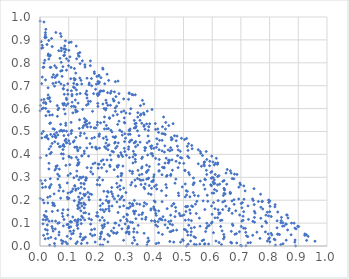
| Category | Series 0 |
|---|---|
| 0.22983809154558177 | 0.45 |
| 0.19908134419561374 | 0.146 |
| 0.5997152492428129 | 0.138 |
| 0.007164142219287739 | 0.599 |
| 0.0896939707701141 | 0.536 |
| 0.6073219868968796 | 0.289 |
| 0.7247909522949211 | 0.175 |
| 0.785337218605948 | 0.062 |
| 0.29158274670867035 | 0.253 |
| 0.219119030528239 | 0.62 |
| 0.079895417914022 | 0.783 |
| 0.443010123358736 | 0.163 |
| 0.23539410950892115 | 0.67 |
| 0.645104258136213 | 0.227 |
| 0.035342745410344545 | 0.217 |
| 0.2579486268440402 | 0.635 |
| 0.455182996522688 | 0.135 |
| 0.22076034341037032 | 0.47 |
| 0.8390355387167334 | 0.006 |
| 0.32476230325268296 | 0.66 |
| 0.5156626599115601 | 0.418 |
| 0.4787509487049356 | 0.436 |
| 0.0877488907301438 | 0.577 |
| 0.595202582789979 | 0.321 |
| 0.6071347860901503 | 0.354 |
| 0.4775670412982136 | 0.48 |
| 0.3501365986118308 | 0.571 |
| 0.3991076413278829 | 0.11 |
| 0.8345178748961445 | 0.05 |
| 0.4131506133833801 | 0.058 |
| 0.6323493692801058 | 0.006 |
| 0.413924206753268 | 0.357 |
| 0.10716386330045502 | 0.731 |
| 0.20674361933425922 | 0.67 |
| 0.13737334830626802 | 0.166 |
| 0.03599392520353095 | 0.833 |
| 0.6105676300017907 | 0.312 |
| 0.6659491913276745 | 0.318 |
| 0.1944987126120863 | 0.432 |
| 0.3768543084163112 | 0.294 |
| 0.32606241878501774 | 0.152 |
| 0.38856958640230965 | 0.252 |
| 0.6231583697942464 | 0.145 |
| 0.4479428745143794 | 0.375 |
| 0.41321850433086904 | 0.013 |
| 0.13390328740313096 | 0.356 |
| 0.5060785191635422 | 0.113 |
| 0.199606144191254 | 0.529 |
| 0.1354090898197403 | 0.29 |
| 0.028877624520622813 | 0.838 |
| 0.28159544959392213 | 0.408 |
| 0.3421246557540789 | 0.09 |
| 0.5133927415989192 | 0.062 |
| 0.05088615665107199 | 0.176 |
| 0.19420080566828313 | 0.516 |
| 0.7032864062047856 | 0.109 |
| 0.8887547121127627 | 0.026 |
| 0.34866646372176424 | 0.453 |
| 0.03736758330463574 | 0.435 |
| 0.4104263386234581 | 0.511 |
| 0.43568910513222026 | 0.092 |
| 0.02880936269122425 | 0.033 |
| 0.7012777690200064 | 0.085 |
| 0.10220997588266534 | 0.083 |
| 0.27101619630426665 | 0.303 |
| 0.04540022441170455 | 0.178 |
| 0.12280621910876055 | 0.728 |
| 0.1643618203284496 | 0.013 |
| 0.5247848008572266 | 0.022 |
| 0.12408645955396047 | 0.594 |
| 0.46171155610594206 | 0.092 |
| 0.007617393135581629 | 0.272 |
| 0.45898449277911313 | 0.175 |
| 0.3781097017972552 | 0.229 |
| 0.20286624528919395 | 0.357 |
| 0.6144595964485684 | 0.383 |
| 0.15229889223409165 | 0.03 |
| 0.1117856311010701 | 0.628 |
| 0.24804315806640787 | 0.237 |
| 0.33272913747503896 | 0.367 |
| 0.3035531496797539 | 0.062 |
| 0.7962292203806334 | 0.132 |
| 0.4853390283668756 | 0.142 |
| 0.31640210495510757 | 0.267 |
| 0.6231140348466867 | 0.139 |
| 0.09086266219053751 | 0.467 |
| 0.43968877468958567 | 0.383 |
| 0.268717188682862 | 0.435 |
| 0.022285916052544708 | 0.395 |
| 0.10389294350010947 | 0.447 |
| 0.35525159273680784 | 0.313 |
| 0.06670246190643081 | 0.06 |
| 0.033506185843492076 | 0.648 |
| 0.23325937065642555 | 0.512 |
| 0.11452356110021011 | 0.249 |
| 0.011025209764628285 | 0.78 |
| 0.045823529845827715 | 0.065 |
| 0.20989672082118782 | 0.176 |
| 0.570576026044303 | 0.027 |
| 0.3649117956664385 | 0.43 |
| 0.20868737621393352 | 0.112 |
| 0.1403265596849641 | 0.041 |
| 0.02700071082554878 | 0.212 |
| 0.38718158488236554 | 0.404 |
| 0.7075553747272044 | 0.13 |
| 0.3720529570165254 | 0.326 |
| 0.15567668014802405 | 0.114 |
| 0.28672232660946606 | 0.484 |
| 0.05554128268936154 | 0.475 |
| 0.09940471700641818 | 0.787 |
| 0.2719187144018069 | 0.146 |
| 0.014164852589793386 | 0.188 |
| 0.18311111495142085 | 0.588 |
| 0.6276213720788766 | 0.144 |
| 0.10872468609692443 | 0.491 |
| 0.31307419825304716 | 0.578 |
| 0.030990323315914226 | 0.586 |
| 0.03175941649704195 | 0.108 |
| 0.16819915318497713 | 0.62 |
| 0.4254553147707639 | 0.193 |
| 0.3239704404850302 | 0.389 |
| 0.3027332633106037 | 0.139 |
| 0.24528816542921406 | 0.615 |
| 0.2744900246830806 | 0.626 |
| 0.0016132835974653759 | 0.613 |
| 0.5108319466928872 | 0.223 |
| 0.09678883453738518 | 0.708 |
| 0.6644558962595496 | 0.016 |
| 0.011944409224524999 | 0.602 |
| 0.22418093780381787 | 0.112 |
| 0.29575154876046983 | 0.49 |
| 0.6081089474664243 | 0.246 |
| 0.5743116641976139 | 0.159 |
| 0.20032399036211235 | 0.541 |
| 0.2518926324256404 | 0.228 |
| 0.23234154357522796 | 0.326 |
| 0.07933373705166058 | 0.621 |
| 0.057720172669965986 | 0.495 |
| 0.0969131433352669 | 0.663 |
| 0.21874196182944483 | 0.078 |
| 0.20704820482246056 | 0.716 |
| 0.6044765502008079 | 0.058 |
| 0.0767854849550389 | 0.766 |
| 0.5972340974798366 | 0.263 |
| 0.32795129650782073 | 0.45 |
| 0.3141104313805243 | 0.488 |
| 0.03724323385470163 | 0.487 |
| 0.6129981063594038 | 0.022 |
| 0.12658543550032653 | 0.387 |
| 0.15893479047508952 | 0.665 |
| 0.34762550791678803 | 0.182 |
| 0.48948382274912483 | 0.386 |
| 0.29390892636402466 | 0.54 |
| 0.308312179387804 | 0.488 |
| 0.3736149660130915 | 0.451 |
| 0.8003424592011547 | 0.15 |
| 0.2880554089311357 | 0.391 |
| 0.042440095355538054 | 0.448 |
| 0.1715144655749572 | 0.201 |
| 0.4530515206350513 | 0.062 |
| 0.43226397837806274 | 0.344 |
| 0.10823628351324421 | 0.78 |
| 0.3550344364510811 | 0.138 |
| 0.40965054416847324 | 0.085 |
| 0.09500624970112082 | 0.275 |
| 0.24993690789494627 | 0.255 |
| 0.1694066818932014 | 0.213 |
| 0.01691803221158772 | 0.811 |
| 0.2783758258632181 | 0.203 |
| 0.06255187865633749 | 0.485 |
| 0.1635770097083742 | 0.66 |
| 0.06669669389092658 | 0.102 |
| 0.1308371426013395 | 0.094 |
| 0.23563879771404894 | 0.437 |
| 0.018748032503698386 | 0.627 |
| 0.22940146049316168 | 0.16 |
| 0.7737500048406573 | 0.194 |
| 0.14602327310163798 | 0.174 |
| 0.017952345185939356 | 0.128 |
| 0.44864140003763264 | 0.526 |
| 0.27058253909306973 | 0.531 |
| 0.21506976572818637 | 0.061 |
| 0.4861445456414326 | 0.362 |
| 0.20580685581144864 | 0.745 |
| 0.08452357790766629 | 0.662 |
| 0.3462890375992945 | 0.31 |
| 0.4254284424426502 | 0.461 |
| 0.15848723044341384 | 0.145 |
| 0.20607682915421321 | 0.485 |
| 0.09602733823993781 | 0.68 |
| 0.07718084197310515 | 0.011 |
| 0.37144409473967255 | 0.353 |
| 0.09851047647850619 | 0.485 |
| 0.6411399651229285 | 0.23 |
| 0.5443122631118559 | 0.006 |
| 0.4761707603546661 | 0.069 |
| 0.09227072142790615 | 0.768 |
| 0.025740941462616296 | 0.053 |
| 0.09675312777924316 | 0.135 |
| 0.028545784552477693 | 0.832 |
| 0.3622522345572261 | 0.522 |
| 0.1753061794836165 | 0.788 |
| 0.310397906227159 | 0.506 |
| 0.7759898915266076 | 0.162 |
| 0.2248600024443631 | 0.095 |
| 0.42533160733147846 | 0.415 |
| 0.0744034372403356 | 0.025 |
| 0.12055550747132071 | 0.724 |
| 0.2547603186861138 | 0.642 |
| 0.2057409850787344 | 0.662 |
| 0.04905516021205014 | 0.227 |
| 0.34498503380746937 | 0.481 |
| 0.380623455098299 | 0.458 |
| 0.48326859362825947 | 0.22 |
| 0.15271770023522313 | 0.145 |
| 0.04413134343838154 | 0.188 |
| 0.45131135457855 | 0.374 |
| 0.3869929599295576 | 0.162 |
| 0.1640231174960599 | 0.646 |
| 0.304521435448285 | 0.109 |
| 0.23669357025463855 | 0.42 |
| 0.356895663625873 | 0.388 |
| 0.1159264949751404 | 0.454 |
| 0.059843895824129856 | 0.351 |
| 0.08387463128303485 | 0.701 |
| 0.16263499036834217 | 0.676 |
| 0.05523552133052967 | 0.932 |
| 0.22450591101016404 | 0.511 |
| 0.10877854047117186 | 0.89 |
| 0.3772847795016342 | 0.332 |
| 0.1543583846650134 | 0.404 |
| 0.5812953764688514 | 0.099 |
| 0.14619732621630221 | 0.394 |
| 0.4250839352089274 | 0.311 |
| 0.020333274851094152 | 0.946 |
| 0.6056954125628229 | 0.231 |
| 0.2355532261898352 | 0.239 |
| 0.6437041074074213 | 0.197 |
| 0.14000684765860272 | 0.481 |
| 0.22314401159106578 | 0.6 |
| 0.3376150945769444 | 0.184 |
| 0.1317986939736795 | 0.421 |
| 0.47925066438179953 | 0.395 |
| 0.5208977670027006 | 0.312 |
| 0.17214400712558453 | 0.537 |
| 0.3861492801350066 | 0.157 |
| 0.09290882718524807 | 0.639 |
| 0.599848263608036 | 0.105 |
| 0.1395450828479352 | 0.429 |
| 0.32187929252849545 | 0.012 |
| 0.6697621595087512 | 0.294 |
| 0.14560242676707014 | 0.393 |
| 0.21006782144416358 | 0.202 |
| 0.21015814796999333 | 0.005 |
| 0.10611572812626646 | 0.316 |
| 0.05054435200333651 | 0.698 |
| 0.31071254869767173 | 0.666 |
| 0.29792255460001793 | 0.471 |
| 0.7923790093324606 | 0.022 |
| 0.010213812408769618 | 0.201 |
| 0.7950711700985938 | 0.052 |
| 0.5969032744555915 | 0.099 |
| 0.0977804209362122 | 0.308 |
| 0.2915377786584893 | 0.127 |
| 0.2252557374518328 | 0.433 |
| 0.1637505645012356 | 0.733 |
| 0.3989233672886223 | 0.26 |
| 0.23000925067452194 | 0.427 |
| 0.7096887750839194 | 0.15 |
| 0.30828797830343513 | 0.086 |
| 0.10649183513537908 | 0.105 |
| 0.6096933257276025 | 0.123 |
| 0.8285788000990977 | 0.052 |
| 0.508426140526527 | 0.151 |
| 0.11798784120122419 | 0.298 |
| 0.1289301922075382 | 0.706 |
| 0.24772258445125672 | 0.376 |
| 0.1013909108808072 | 0.888 |
| 0.18684375712900825 | 0.665 |
| 0.14876023751280865 | 0.597 |
| 0.3950245466585307 | 0.288 |
| 0.7456210005944095 | 0.25 |
| 0.25472191362465946 | 0.477 |
| 0.5683867178307993 | 0.197 |
| 0.5238003077790268 | 0.143 |
| 0.31153030664515224 | 0.386 |
| 0.5515167687683253 | 0.219 |
| 0.35569195992829883 | 0.346 |
| 0.1247621332642429 | 0.585 |
| 0.5027710454159313 | 0.073 |
| 0.1902489095130374 | 0.074 |
| 0.09741498669134696 | 0.231 |
| 0.5723888892260892 | 0.364 |
| 0.5222608605613729 | 0.215 |
| 0.32631447980996575 | 0.062 |
| 0.14303014366388211 | 0.187 |
| 0.16832980466647773 | 0.632 |
| 0.7471970705102083 | 0.125 |
| 0.013825763591752027 | 0.978 |
| 0.23756245329570702 | 0.234 |
| 0.6790439514985744 | 0.051 |
| 0.12694784922845181 | 0.682 |
| 0.31632442935935057 | 0.599 |
| 0.5746501478011992 | 0.249 |
| 0.2672810010500014 | 0.273 |
| 0.10943289210255869 | 0.678 |
| 0.23632079960687413 | 0.101 |
| 0.3346532825761013 | 0.522 |
| 0.07447348686510236 | 0.403 |
| 0.1984551489870775 | 0.741 |
| 0.2725122334901875 | 0.45 |
| 0.3638426316533929 | 0.189 |
| 0.8763490545420551 | 0.1 |
| 0.018412435191031085 | 0.287 |
| 0.39350846236505743 | 0.282 |
| 0.142209735021382 | 0.154 |
| 0.5269304442516334 | 0.078 |
| 0.5949460810735385 | 0.267 |
| 0.8748520122112083 | 0.049 |
| 0.4552375410246655 | 0.308 |
| 0.11438088942698654 | 0.581 |
| 0.0003297571966303092 | 0.591 |
| 0.36171467460315165 | 0.174 |
| 0.1194945845688754 | 0.198 |
| 0.8581957649946669 | 0.096 |
| 0.27530601115749875 | 0.545 |
| 0.06736494009097382 | 0.336 |
| 0.2133387354526326 | 0.371 |
| 0.018967761436113673 | 0.922 |
| 0.7416334876939826 | 0.108 |
| 0.2691589806486965 | 0.059 |
| 0.05006375170137756 | 0.488 |
| 0.710655721675009 | 0.204 |
| 0.028331206632878914 | 0.659 |
| 0.2778698911681382 | 0.506 |
| 0.04537954547279377 | 0.512 |
| 0.00955417004823178 | 0.866 |
| 0.21892440444494843 | 0.158 |
| 0.5764943431774067 | 0.29 |
| 0.641332280617996 | 0.286 |
| 0.2019568935867051 | 0.718 |
| 0.1117294224556179 | 0.662 |
| 0.5568156726696044 | 0.009 |
| 0.5383375147326835 | 0.221 |
| 0.21731861665811392 | 0.124 |
| 0.043562008498204574 | 0.478 |
| 0.02265771651631643 | 0.127 |
| 0.30547117231487464 | 0.077 |
| 0.33960100745389643 | 0.503 |
| 0.3516630818490215 | 0.576 |
| 0.26699960847603 | 0.611 |
| 0.5161626294733838 | 0.008 |
| 0.10017747117981057 | 0.459 |
| 0.5705428388853448 | 0.267 |
| 0.37092924018513684 | 0.321 |
| 0.4087282657996669 | 0.445 |
| 0.1602416541253373 | 0.548 |
| 0.10093749636690752 | 0.392 |
| 0.7052309493782187 | 0.189 |
| 0.7995620998779427 | 0.035 |
| 0.31232437842302874 | 0.187 |
| 0.2378890744374268 | 0.192 |
| 0.2419529428164513 | 0.56 |
| 0.30087493365146967 | 0.396 |
| 0.09126630392012702 | 0.452 |
| 0.6238388037731578 | 0.015 |
| 0.1800265131965687 | 0.7 |
| 0.16011692055473126 | 0.299 |
| 0.19934760770364868 | 0.268 |
| 0.08141855229150918 | 0.685 |
| 0.010505134488856704 | 0.097 |
| 0.4702246636931964 | 0.274 |
| 0.13874376551618417 | 0.733 |
| 0.39785569216833405 | 0.197 |
| 0.06576655381160812 | 0.241 |
| 0.08006007172794993 | 0.421 |
| 0.3305785871625866 | 0.288 |
| 0.35764090931583503 | 0.145 |
| 0.027456154410407385 | 0.188 |
| 0.02300416168342545 | 0.475 |
| 0.6634401541523656 | 0.328 |
| 0.27362859896790204 | 0.352 |
| 0.8204217902253882 | 0.004 |
| 0.3129999979437813 | 0.328 |
| 0.7101781689570346 | 0.262 |
| 0.17650424499623363 | 0.096 |
| 0.38676085012707917 | 0.225 |
| 0.44659965223322295 | 0.419 |
| 0.352164696705934 | 0.269 |
| 0.2409870589059776 | 0.174 |
| 0.1098488991480252 | 0.105 |
| 0.29143534054435394 | 0.176 |
| 0.4207448839102671 | 0.118 |
| 0.17693648418896113 | 0.324 |
| 0.15535783641686085 | 0.219 |
| 0.10129233951164118 | 0.08 |
| 0.04243257153212954 | 0.737 |
| 0.5994236150625256 | 0.231 |
| 0.2572833044005568 | 0.079 |
| 0.4429885186334278 | 0.308 |
| 0.19765338497646479 | 0.423 |
| 0.09236046137000375 | 0.501 |
| 0.09723235908333183 | 0.621 |
| 0.474569462545823 | 0.46 |
| 0.68196055332521 | 0.154 |
| 0.2718994629979634 | 0.72 |
| 0.15644529535655272 | 0.54 |
| 0.9010268931847217 | 0.085 |
| 0.3541933756344131 | 0.382 |
| 0.20413184042774646 | 0.709 |
| 0.3783777124661357 | 0.296 |
| 0.5187034249076631 | 0.385 |
| 0.2913446741966711 | 0.025 |
| 0.09193069627780082 | 0.645 |
| 0.0334301473233366 | 0.254 |
| 0.39023041079782794 | 0.596 |
| 0.5809762713906712 | 0.312 |
| 0.707669149434351 | 0.112 |
| 0.11740138840578718 | 0.067 |
| 0.44104082679229717 | 0.255 |
| 0.02130999405792322 | 0.912 |
| 0.5663367206638138 | 0.395 |
| 0.5417802505153535 | 0.036 |
| 0.6595785318298041 | 0.163 |
| 0.40115120482887967 | 0.107 |
| 0.5651013244718905 | 0.023 |
| 0.334058092570407 | 0.119 |
| 0.10841984759470413 | 0.54 |
| 0.5107782542650815 | 0 |
| 0.5578578778705109 | 0.087 |
| 0.5464963626441423 | 0.195 |
| 0.005850839511487793 | 0.472 |
| 0.18911030534135276 | 0.76 |
| 0.23922625455697422 | 0.723 |
| 0.6088531466980809 | 0.273 |
| 0.2296727964449563 | 0.637 |
| 0.41545643747672023 | 0.378 |
| 0.05548190406240727 | 0.713 |
| 0.13278089774897717 | 0.624 |
| 0.8157932399359287 | 0.03 |
| 0.642054844559553 | 0.039 |
| 0.10386264685265334 | 0.355 |
| 0.20716756054192453 | 0.427 |
| 0.1538333645575244 | 0.27 |
| 0.32249637908279594 | 0.325 |
| 0.5282785100222223 | 0.175 |
| 0.45980679452926554 | 0.42 |
| 0.6344815472970814 | 0.066 |
| 0.28412332196228374 | 0.398 |
| 0.620697888162278 | 0.158 |
| 0.5515811419882717 | 0.42 |
| 0.22252128986249142 | 0.239 |
| 0.6636699696298394 | 0.231 |
| 0.017861685351662215 | 0.031 |
| 0.09504429866189112 | 0.009 |
| 0.12756824862064253 | 0.431 |
| 0.32377675979506115 | 0.176 |
| 0.37647056173340476 | 0.48 |
| 0.8392144233645228 | 0.101 |
| 0.2157915670712931 | 0.677 |
| 0.11028088405101633 | 0.053 |
| 0.15874170975797564 | 0.225 |
| 0.2967987316556876 | 0.096 |
| 0.1322302348566199 | 0.363 |
| 0.6956945030735663 | 0.135 |
| 0.08678031790423835 | 0.861 |
| 0.2627896808499185 | 0.588 |
| 0.12324553906847735 | 0.607 |
| 0.2312485183635674 | 0.527 |
| 0.40711816386848454 | 0.469 |
| 0.6094105534883463 | 0.163 |
| 0.45586507209330585 | 0.313 |
| 0.03804109599436645 | 0.78 |
| 0.43233375955910747 | 0.34 |
| 0.18479088550696332 | 0.359 |
| 0.320158508591197 | 0.662 |
| 0.7146847294360805 | 0.241 |
| 0.03382524597566561 | 0.259 |
| 0.06149360068070575 | 0.313 |
| 0.01973373441708204 | 0.114 |
| 0.23343858759627256 | 0.376 |
| 0.48849306399911807 | 0.132 |
| 0.5376040100924259 | 0.007 |
| 0.6393994848961945 | 0.031 |
| 0.818455024495479 | 0.171 |
| 0.3350896674969941 | 0.536 |
| 0.110480483096283 | 0.505 |
| 0.7240341633190557 | 0.041 |
| 0.5585015953794689 | 0.283 |
| 0.4659810963915374 | 0.017 |
| 0.42676031834220407 | 0.521 |
| 0.07219634070440062 | 0.764 |
| 0.2363665977274919 | 0.614 |
| 0.1826859060298326 | 0.045 |
| 0.7475893114301234 | 0.104 |
| 0.24200520785465096 | 0.044 |
| 0.5144376724834677 | 0.392 |
| 0.21847773720311148 | 0.777 |
| 0.5374254720393294 | 0.276 |
| 0.24225625867225964 | 0.557 |
| 0.012442873871048588 | 0.047 |
| 0.3084789643060576 | 0.423 |
| 0.4939027642042332 | 0.384 |
| 0.40180091608897683 | 0.535 |
| 0.16922006300866543 | 0.393 |
| 0.13210858135200232 | 0.179 |
| 0.4471251678507119 | 0.363 |
| 0.24060563641621613 | 0.196 |
| 0.034049979472449254 | 0.571 |
| 0.011065617490073731 | 0.115 |
| 0.105342481572271 | 0.065 |
| 0.3329270395966244 | 0.261 |
| 0.14405989904489302 | 0.297 |
| 0.17417847088035787 | 0.228 |
| 0.10538952561056691 | 0.106 |
| 0.9581421966861708 | 0.021 |
| 0.18973010301645232 | 0.474 |
| 0.6759297967849605 | 0.202 |
| 0.5791391215487673 | 0.413 |
| 0.033750627283980816 | 0.535 |
| 0.5178101564285752 | 0.321 |
| 0.2923887168531286 | 0.59 |
| 0.375088854308389 | 0.398 |
| 0.2611203915764875 | 0.1 |
| 0.5094575321897499 | 0.242 |
| 0.42528783269703996 | 0.491 |
| 0.4267778034146782 | 0.344 |
| 0.03778625696997384 | 0.038 |
| 0.48152222903780906 | 0.42 |
| 0.09737871355513472 | 0.158 |
| 0.1942244349229526 | 0.429 |
| 0.6389829288760931 | 0.221 |
| 0.41364354237235823 | 0.153 |
| 0.3853160545255848 | 0.435 |
| 0.08259335720314709 | 0.832 |
| 0.11579642854493988 | 0.055 |
| 0.0515692946916374 | 0.455 |
| 0.06735848690934276 | 0.305 |
| 0.2915028528496266 | 0.642 |
| 0.308460791666028 | 0.64 |
| 0.3286234246829691 | 0.548 |
| 0.5008563629636766 | 0.361 |
| 0.47226965303895596 | 0.169 |
| 0.054591986709697116 | 0.474 |
| 0.3386406784563618 | 0.06 |
| 0.5033334977521045 | 0.465 |
| 0.13438381104047392 | 0.83 |
| 0.15136107595194093 | 0.035 |
| 0.19954297960083212 | 0.664 |
| 0.31411875100803643 | 0.511 |
| 0.6988214468137611 | 0.267 |
| 0.43953830280979944 | 0.22 |
| 0.4255286360750511 | 0.114 |
| 0.8053340169615223 | 0.055 |
| 0.7495097289724649 | 0.144 |
| 0.007831793841000967 | 0.738 |
| 0.17090426612980925 | 0.704 |
| 0.27372720409583595 | 0.39 |
| 0.08209150655535602 | 0.615 |
| 0.5380603237017995 | 0.081 |
| 0.29931146623362437 | 0.233 |
| 0.32374976471833594 | 0.362 |
| 0.2635606872997509 | 0.478 |
| 0.38839543436019475 | 0.426 |
| 0.7176841306335754 | 0.001 |
| 0.013561376033001338 | 0.781 |
| 0.6183595441218668 | 0.357 |
| 0.2593649315224684 | 0.673 |
| 0.5136395957240167 | 0.239 |
| 0.001046849928671656 | 0.207 |
| 0.2850175077596826 | 0.499 |
| 0.12993587444031862 | 0.588 |
| 0.7009712456228683 | 0.186 |
| 0.043835905482007664 | 0.076 |
| 0.6369956819561499 | 0.282 |
| 0.09965065088244596 | 0.809 |
| 0.22368035815265852 | 0.15 |
| 0.25113869314758097 | 0.175 |
| 0.2623795001466853 | 0.718 |
| 0.21897610732814943 | 0.004 |
| 0.16219542556266342 | 0.471 |
| 0.3285681724133154 | 0.4 |
| 0.07113895367197687 | 0.434 |
| 0.4573369813568904 | 0.474 |
| 0.3388774088600235 | 0.007 |
| 0.6340281705844446 | 0.113 |
| 0.12937718688149968 | 0.103 |
| 0.6368320411075797 | 0.192 |
| 0.6478404972468087 | 0.174 |
| 0.6863580719871143 | 0.313 |
| 0.47402783756719014 | 0.37 |
| 0.13677537240101822 | 0.513 |
| 0.28256557163270346 | 0.287 |
| 0.2286907160184647 | 0.594 |
| 0.8258026152972829 | 0.079 |
| 0.06055140690201288 | 0.566 |
| 0.44919411851088276 | 0.367 |
| 0.79727810647802 | 0.19 |
| 0.9341220463402419 | 0.042 |
| 0.42025482078697673 | 0.118 |
| 0.30008330467448796 | 0.058 |
| 0.4361867620416521 | 0.113 |
| 0.37927559630223107 | 0.023 |
| 0.7198845275423773 | 0.044 |
| 0.6666566699621849 | 0.064 |
| 0.37196477854989374 | 0.292 |
| 0.052020839660744556 | 0.001 |
| 0.3623660785700197 | 0.256 |
| 0.6722112548785681 | 0.09 |
| 0.3331002809967669 | 0.152 |
| 0.10185156855351996 | 0.389 |
| 0.1387390096988952 | 0.202 |
| 0.019256369466926215 | 0.725 |
| 0.507449872713599 | 0.172 |
| 0.14766538337103519 | 0.809 |
| 0.31070930159871135 | 0.669 |
| 0.13246229822033573 | 0.377 |
| 0.3394845896473373 | 0.295 |
| 0.481168403840343 | 0.342 |
| 0.8462968658259709 | 0.102 |
| 0.012362392229383179 | 0.626 |
| 0.7695625642724592 | 0.169 |
| 0.6629801265883766 | 0.229 |
| 0.3654073557050346 | 0.417 |
| 0.005868267839504782 | 0.491 |
| 0.17678542131819852 | 0.52 |
| 0.07379858353850033 | 0.915 |
| 0.1710050632833463 | 0.12 |
| 0.21124512996820843 | 0.159 |
| 0.12531312977310238 | 0.011 |
| 0.2646648985111125 | 0.652 |
| 0.08982989586093582 | 0.017 |
| 0.09318836449005674 | 0.45 |
| 0.20199258728417635 | 0.61 |
| 0.19362659126665882 | 0.684 |
| 0.12802565685689138 | 0.306 |
| 0.372535028935728 | 0.004 |
| 0.3715675844283156 | 0.533 |
| 0.23173947018421504 | 0.625 |
| 0.5624040505836487 | 0.348 |
| 0.3330224804653644 | 0.398 |
| 0.3678532503866636 | 0.116 |
| 0.06642084102288281 | 0.716 |
| 0.4335663286456667 | 0.41 |
| 0.3151432347697991 | 0.461 |
| 0.7168333042819408 | 0.06 |
| 0.07761017417603266 | 0.143 |
| 0.49563347319558526 | 0.258 |
| 0.13985334968528795 | 0.666 |
| 0.030639733991403184 | 0.897 |
| 0.46141182268049485 | 0.331 |
| 0.05567169788946702 | 0.348 |
| 0.46373036584263916 | 0.534 |
| 0.27530070676149754 | 0.665 |
| 0.08100139349741242 | 0.687 |
| 0.7429205488561517 | 0.199 |
| 0.7331927890842173 | 0.015 |
| 0.8403759133265896 | 0.111 |
| 0.2395051948374758 | 0.163 |
| 0.2992415033909227 | 0.581 |
| 0.24463293957364374 | 0.397 |
| 0.0024579405141654798 | 0.286 |
| 0.23350019952718892 | 0.464 |
| 0.45785286358022415 | 0.463 |
| 0.41620517333085627 | 0.118 |
| 0.14173965098500818 | 0.053 |
| 0.15774537383486764 | 0.181 |
| 0.3788644881143316 | 0.521 |
| 0.7464729388665174 | 0.181 |
| 0.223426901780593 | 0.541 |
| 0.5341638437402618 | 0.234 |
| 0.19223355283064003 | 0.017 |
| 0.19180242507096823 | 0.363 |
| 0.2840761505455389 | 0.212 |
| 0.20577034109383951 | 0.479 |
| 0.6035981990897986 | 0.298 |
| 0.44065295817963845 | 0.304 |
| 0.34140090518414357 | 0.33 |
| 0.92256275840886 | 0.047 |
| 0.03873761867775549 | 0.268 |
| 0.06592071565910063 | 0.048 |
| 0.6403940539323004 | 0.05 |
| 0.46870246043408836 | 0.481 |
| 0.09419554742098502 | 0.093 |
| 0.0815330941499256 | 0.443 |
| 0.32720479762737986 | 0.149 |
| 0.3974778901189997 | 0.311 |
| 0.013861882727537522 | 0.799 |
| 0.413019744968843 | 0.496 |
| 0.5828406101579902 | 0.222 |
| 0.34055521024812907 | 0.441 |
| 0.030752958518464935 | 0.816 |
| 0.01886577960816238 | 0.073 |
| 0.8193559323367025 | 0.18 |
| 0.3627551873778835 | 0.527 |
| 0.7412730431847301 | 0.047 |
| 0.07208363649609317 | 0.209 |
| 0.04306260757984903 | 0.572 |
| 0.7966981950533119 | 0.031 |
| 0.17545489509218182 | 0.808 |
| 0.29364955193188247 | 0.559 |
| 0.0900612143977777 | 0.858 |
| 0.8561365447801629 | 0.096 |
| 0.5846427798265887 | 0.195 |
| 0.46523735635299246 | 0.184 |
| 0.4550906977072152 | 0.429 |
| 0.7920720708278822 | 0.147 |
| 0.2755860490711729 | 0.09 |
| 0.21825258806847692 | 0.185 |
| 0.2830898850140222 | 0.317 |
| 0.2726974499205229 | 0.395 |
| 0.6853904688942519 | 0.013 |
| 0.26031179541584193 | 0.449 |
| 0.45632003804728827 | 0.11 |
| 0.5727151309345602 | 0.35 |
| 0.1333471234252861 | 0.116 |
| 0.13974918552758175 | 0.796 |
| 0.09245338171168549 | 0.818 |
| 0.28902593287807365 | 0.349 |
| 0.5839465911075478 | 0.086 |
| 0.27805346436920664 | 0.171 |
| 0.09470996719132341 | 0.042 |
| 0.16322533621074808 | 0.532 |
| 0.07992239760024922 | 0.438 |
| 0.3106080896860678 | 0.061 |
| 0.92819875831006 | 0.049 |
| 0.47329735223945746 | 0.152 |
| 0.8008333004211189 | 0.197 |
| 0.09776587787279167 | 0.095 |
| 0.7694863777700617 | 0.121 |
| 0.02425668994270369 | 0.88 |
| 0.2569248054742196 | 0.058 |
| 0.801038873264505 | 0.018 |
| 0.4601607399499196 | 0.376 |
| 0.13873477118272648 | 0.845 |
| 0.3313384857595939 | 0.453 |
| 0.2569346102793135 | 0.057 |
| 0.08854976797747349 | 0.896 |
| 0.03133946428389267 | 0.361 |
| 0.08628631053819502 | 0.846 |
| 0.2937947564890887 | 0.427 |
| 0.3748799552968888 | 0.016 |
| 0.5217597325544605 | 0.157 |
| 0.3893521680757138 | 0.438 |
| 0.41504525201039066 | 0.42 |
| 0.3048149835074516 | 0.136 |
| 0.6190874228933945 | 0.303 |
| 0.14641699422671195 | 0.209 |
| 0.08385439253994342 | 0.597 |
| 0.23661610090439 | 0.018 |
| 0.2694758795108846 | 0.574 |
| 0.598537671431703 | 0.325 |
| 0.03570251241374234 | 0.294 |
| 0.09028489151009222 | 0.352 |
| 0.0687203914627239 | 0.502 |
| 0.26202183723249295 | 0.453 |
| 0.2309880751501142 | 0.199 |
| 0.7892549185249484 | 0.101 |
| 0.44479778823086347 | 0.079 |
| 0.38836024665424107 | 0.11 |
| 0.1282548630273821 | 0.663 |
| 0.43851020717108147 | 0.268 |
| 0.515219130196475 | 0.048 |
| 0.13201916569621697 | 0.109 |
| 0.1523223751810101 | 0.226 |
| 0.05013649013924093 | 0.509 |
| 0.4482263325249325 | 0.107 |
| 0.36588029521610776 | 0.51 |
| 0.35518715709661397 | 0.118 |
| 0.4820396276881629 | 0.231 |
| 0.6923366959066815 | 0.205 |
| 0.15504260508921575 | 0.25 |
| 0.2702288829531846 | 0.344 |
| 0.15274896461468934 | 0.188 |
| 0.2469440793030666 | 0.505 |
| 0.29268810367570486 | 0.2 |
| 0.17989862146113145 | 0.225 |
| 0.154255392026458 | 0.166 |
| 0.20609612072643024 | 0.357 |
| 0.5734217953538464 | 0.008 |
| 0.16213869272391412 | 0.615 |
| 0.669434342520663 | 0.143 |
| 0.08467583077984198 | 0.622 |
| 0.7859146090848776 | 0.108 |
| 0.4964271602490411 | 0.028 |
| 0.054311993528397995 | 0.109 |
| 0.0010043934658043874 | 0.385 |
| 0.025887375230840504 | 0.117 |
| 0.16319564186178714 | 0.428 |
| 0.6983998730837557 | 0.002 |
| 0.4305457838342597 | 0.563 |
| 0.850296389233931 | 0.088 |
| 0.1236794188804008 | 0.112 |
| 0.5710528791730959 | 0.355 |
| 0.5996737226927208 | 0.299 |
| 0.5275749386702289 | 0.111 |
| 0.36079082177513055 | 0.581 |
| 0.03157625841509715 | 0.424 |
| 0.11148122491659729 | 0.239 |
| 0.15683088810770285 | 0.781 |
| 0.6964818441646387 | 0.275 |
| 0.43514477470513013 | 0.437 |
| 0.046742627700070316 | 0.748 |
| 0.5968625439782828 | 0.296 |
| 0.6482210143608772 | 0.318 |
| 0.6365496655152194 | 0.159 |
| 0.15825296385607146 | 0.039 |
| 0.10667471488494473 | 0.032 |
| 0.5346792323479308 | 0.297 |
| 0.1489975697415541 | 0.517 |
| 0.19699309918372854 | 0.131 |
| 0.18891509185438637 | 0.516 |
| 0.15642575667131786 | 0.791 |
| 0.04222730407047848 | 0.109 |
| 0.014862018574055114 | 0.134 |
| 0.31973590191573975 | 0.463 |
| 0.527184798185021 | 0.062 |
| 0.6026502145411222 | 0.367 |
| 0.19674845272171548 | 0.707 |
| 0.020605325029193988 | 0.621 |
| 0.7263989900923171 | 0.116 |
| 0.5446079226977579 | 0.142 |
| 0.40676897144285407 | 0.249 |
| 0.05023395329174929 | 0.011 |
| 0.13797143958392455 | 0.186 |
| 0.3018370973388438 | 0.116 |
| 0.005338423755096522 | 0.863 |
| 0.6776795763177432 | 0.314 |
| 0.14688705288352277 | 0.026 |
| 0.7734955005111254 | 0.086 |
| 0.23374865259232613 | 0.75 |
| 0.48993908840981537 | 0.017 |
| 0.3569155014036659 | 0.636 |
| 0.4607883866906549 | 0.467 |
| 0.23650975808030117 | 0.051 |
| 0.2865703081561587 | 0.217 |
| 0.15012838716194477 | 0.302 |
| 0.053262072357693424 | 0.074 |
| 0.3225091818809068 | 0.184 |
| 0.0808231428189049 | 0.382 |
| 0.4371407621705429 | 0.51 |
| 0.060086755846843976 | 0.613 |
| 0.17936663757435867 | 0.115 |
| 0.3646959365357074 | 0.25 |
| 0.08376504737914481 | 0.504 |
| 0.04006582925424629 | 0.906 |
| 0.1533537460398866 | 0.183 |
| 0.07386854299457568 | 0.506 |
| 0.5256365118735866 | 0.047 |
| 0.1317585090204172 | 0.416 |
| 0.02820122844541806 | 0.588 |
| 0.06537962001497699 | 0.853 |
| 0.5417171833420189 | 0.183 |
| 0.270129554699157 | 0.257 |
| 0.574529577746519 | 0.01 |
| 0.5769208421475767 | 0.063 |
| 0.6186744212054441 | 0.123 |
| 0.12126080849665932 | 0.112 |
| 0.07699680673514409 | 0.741 |
| 0.33187361440319685 | 0.379 |
| 0.0512981326955243 | 0.787 |
| 0.04812675604911454 | 0.185 |
| 0.5054812246521942 | 0.33 |
| 0.1744282103829926 | 0.447 |
| 0.340892226844577 | 0.582 |
| 0.14922930747834906 | 0.124 |
| 0.5319179017072497 | 0.172 |
| 0.21100191069455276 | 0.055 |
| 0.33300664458037954 | 0.434 |
| 0.22200137084122284 | 0.677 |
| 0.020521606972144668 | 0.569 |
| 0.035452218563024385 | 0.78 |
| 0.310340904750228 | 0.053 |
| 0.27953078122047925 | 0.246 |
| 0.7870763182876382 | 0.135 |
| 0.05762589611119029 | 0.743 |
| 0.45328753719928205 | 0.096 |
| 0.3334689972915357 | 0.456 |
| 0.9227971435524341 | 0.053 |
| 0.2854305450952753 | 0.316 |
| 0.2184681471602663 | 0.288 |
| 0.25737279528254464 | 0.633 |
| 0.04291592624914353 | 0.151 |
| 0.33212308721618167 | 0.66 |
| 0.053193774273414984 | 0.481 |
| 0.09106246006187324 | 0.614 |
| 0.21078948757857718 | 0.538 |
| 0.0628540400960016 | 0.446 |
| 0.40280751193577446 | 0.383 |
| 0.12465018564383756 | 0.755 |
| 0.12851059012824728 | 0.432 |
| 0.36183687722435387 | 0.62 |
| 0.13447022103292028 | 0.214 |
| 0.062407153723514464 | 0.099 |
| 0.11874264208067031 | 0.732 |
| 0.3693310937175184 | 0.125 |
| 0.49288641892566176 | 0.47 |
| 0.019566342504220846 | 0.258 |
| 0.3327373983022659 | 0.516 |
| 0.003862295681528627 | 0.637 |
| 0.12508246198234207 | 0.249 |
| 0.2043660393041944 | 0.743 |
| 0.8594760356624691 | 0.136 |
| 0.16184099197446944 | 0.295 |
| 0.12764785331046624 | 0.817 |
| 0.12922637924445868 | 0.705 |
| 0.0181536110840973 | 0.91 |
| 0.8981147789623779 | 0.086 |
| 0.20669325962063378 | 0.299 |
| 0.1807126537604251 | 0.47 |
| 0.07933414500913216 | 0.129 |
| 0.7664222149741636 | 0.033 |
| 0.3215935971954804 | 0.317 |
| 0.885407368198286 | 0.1 |
| 0.021222143251904302 | 0.152 |
| 0.15307536473935168 | 0.273 |
| 0.008881452741291151 | 0.255 |
| 0.3500463485713381 | 0.613 |
| 0.8879209724194703 | 0.017 |
| 0.13169804044931477 | 0.175 |
| 0.27251139741864727 | 0.219 |
| 0.5042444351177279 | 0.33 |
| 0.14161454249225125 | 0.493 |
| 0.0807128020463832 | 0.02 |
| 0.0782523852167184 | 0.501 |
| 0.25490362164515223 | 0.57 |
| 0.3806529719668643 | 0.264 |
| 0.07108889005848307 | 0.928 |
| 0.4286585530529896 | 0.128 |
| 0.8452476606608146 | 0.087 |
| 0.06256044492838464 | 0.595 |
| 0.14162851310402713 | 0.114 |
| 0.1797022239690531 | 0.071 |
| 0.04248296746631597 | 0.871 |
| 0.39624266650612183 | 0.301 |
| 0.24299702347329444 | 0.353 |
| 0.8281208577108036 | 0.052 |
| 0.6045435041118383 | 0.19 |
| 0.1906788371277507 | 0.048 |
| 0.8904536604941898 | 0.001 |
| 0.7246071866526301 | 0.014 |
| 0.5179494982440023 | 0.115 |
| 0.07196333967614832 | 0.531 |
| 0.5909023163439789 | 0.351 |
| 0.005757172007645028 | 0.709 |
| 0.051843214155464445 | 0.332 |
| 0.08109954445963319 | 0.24 |
| 0.070141222330938 | 0.256 |
| 0.6522464096509558 | 0.334 |
| 0.3711787825421309 | 0.183 |
| 0.5077058084510918 | 0.07 |
| 0.06774229462114134 | 0.266 |
| 0.8261672602963906 | 0.11 |
| 0.6187445563702902 | 0.267 |
| 0.033475779375095716 | 0.003 |
| 0.1666361534360844 | 0.234 |
| 0.5300206834544631 | 0.425 |
| 0.18382451732888705 | 0.314 |
| 0.6625755330432792 | 0.235 |
| 0.8058161262741939 | 0.129 |
| 0.17163694524470385 | 0.712 |
| 0.013997008638993336 | 0.64 |
| 0.13606923178459462 | 0.364 |
| 0.6688670377121442 | 0.197 |
| 0.16201035291656196 | 0.546 |
| 0.1299692243652405 | 0.352 |
| 0.250886862267779 | 0.498 |
| 0.17571501571949744 | 0.631 |
| 0.1546906017949291 | 0.556 |
| 0.20801078410161267 | 0.266 |
| 0.23333433070412102 | 0.216 |
| 0.6285707696290735 | 0.111 |
| 0.07395690389638798 | 0.802 |
| 0.06772783984471964 | 0.433 |
| 0.21336430156981345 | 0.053 |
| 0.6704983321353004 | 0.095 |
| 0.06222425573413626 | 0.292 |
| 0.017776183170066573 | 0.476 |
| 0.38915957222819597 | 0.282 |
| 0.05421335553404871 | 0.032 |
| 0.5106580635930328 | 0.47 |
| 0.5177819365558681 | 0.447 |
| 0.9289679084877422 | 0.024 |
| 0.20911950830094395 | 0.031 |
| 0.2657772463391188 | 0.055 |
| 0.1284560060729707 | 0.327 |
| 0.40314352050879254 | 0.142 |
| 0.3407029342938357 | 0.563 |
| 0.2585640286258263 | 0.333 |
| 0.0824074720090977 | 0.861 |
| 0.031026874307077845 | 0.336 |
| 0.4888698999691843 | 0.413 |
| 0.16501895976268077 | 0.52 |
| 0.2405612683740933 | 0.442 |
| 0.43205211117770814 | 0.49 |
| 0.3959885175773401 | 0.171 |
| 0.4235729850962652 | 0.241 |
| 0.28310582801140416 | 0.307 |
| 0.5733352739343106 | 0.367 |
| 0.37646806472428607 | 0.034 |
| 0.513416732209599 | 0.436 |
| 0.6419184853632239 | 0.249 |
| 0.39287632862346233 | 0.393 |
| 0.01889731601263711 | 0.932 |
| 0.031328391624385055 | 0.643 |
| 0.10439150287377863 | 0.826 |
| 0.4735332524430039 | 0.292 |
| 0.13642942866362007 | 0.829 |
| 0.5103360678218057 | 0.172 |
| 0.32014352874416196 | 0.278 |
| 0.21947141872834564 | 0.772 |
| 0.24540809074283565 | 0.667 |
| 0.13194656651720826 | 0.163 |
| 0.0836247805642496 | 0.116 |
| 0.43576783634826377 | 0.362 |
| 0.4950317817993798 | 0.132 |
| 0.025593325391388144 | 0.069 |
| 0.6157586607854478 | 0.241 |
| 0.17916105854570508 | 0.731 |
| 0.20023694076751553 | 0.288 |
| 0.5975144966859639 | 0.175 |
| 0.08136495611419614 | 0.088 |
| 0.3474411432835982 | 0.29 |
| 0.5917285564326229 | 0.37 |
| 0.2301843068592001 | 0.6 |
| 0.5337519027351073 | 0.268 |
| 0.26796927360062417 | 0.193 |
| 0.004048907594474405 | 0.892 |
| 0.13288159301395042 | 0.84 |
| 0.3812418348621225 | 0.347 |
| 0.11655236810539593 | 0.694 |
| 0.07286579423145167 | 0.708 |
| 0.2805490073390461 | 0.111 |
| 0.1440904499573964 | 0.011 |
| 0.21240079542978219 | 0.735 |
| 0.1642003459515815 | 0.342 |
| 0.2507064708482428 | 0.414 |
| 0.5146184425438551 | 0.173 |
| 0.20708027361396064 | 0.489 |
| 0.5810354234701913 | 0.378 |
| 0.40551577762526914 | 0.267 |
| 0.3092804029918049 | 0.165 |
| 0.22400717847335094 | 0.029 |
| 0.466578251434141 | 0.184 |
| 0.02713113539438483 | 0.645 |
| 0.5514222530486187 | 0.359 |
| 0.31153347346141946 | 0.454 |
| 0.40545268178187466 | 0.431 |
| 0.5016860680664417 | 0.136 |
| 0.579682400698681 | 0.078 |
| 0.11911546859543909 | 0.46 |
| 0.08442678983143204 | 0.434 |
| 0.20267834861151834 | 0.34 |
| 0.6208415835534247 | 0.198 |
| 0.08053039599393286 | 0.158 |
| 0.5366120958139445 | 0.041 |
| 0.12514358609265708 | 0.474 |
| 0.8642095482883163 | 0.122 |
| 0.11992542324292976 | 0.775 |
| 0.7608313113821443 | 0.194 |
| 0.15175910275967164 | 0.525 |
| 0.32848627566334254 | 0.515 |
| 0.7556460963488547 | 0.06 |
| 0.8466720957804754 | 0.01 |
| 0.20120280253445455 | 0.623 |
| 0.3116432963312582 | 0.503 |
| 0.1262665787665227 | 0.873 |
| 0.6842548916297124 | 0.054 |
| 0.11442178236293954 | 0.127 |
| 0.6113222973492568 | 0.361 |
| 0.30899217891552755 | 0.08 |
| 0.03402995636660233 | 0.829 |
| 0.574084400186795 | 0.292 |
| 0.7468048774367704 | 0.151 |
| 0.26231667708826 | 0.603 |
| 0.08127403311636738 | 0.401 |
| 0.10947215973964741 | 0.385 |
| 0.05652928724359163 | 0.339 |
| 0.5287898388257046 | 0.439 |
| 0.21090798857241289 | 0.04 |
| 0.028800628995908295 | 0.467 |
| 0.22372495848373697 | 0.086 |
| 0.715367789573204 | 0.077 |
| 0.6765186258454208 | 0.182 |
| 0.03653217857736102 | 0.538 |
| 0.39762817209477497 | 0.163 |
| 0.41636987339926723 | 0.461 |
| 0.6258774517462591 | 0.27 |
| 0.8612874987431739 | 0.135 |
| 0.23876272279265542 | 0.189 |
| 0.694770146736273 | 0.062 |
| 0.26092999230235525 | 0.473 |
| 0.2489387496577784 | 0.066 |
| 0.08702193102316058 | 0.461 |
| 0.2384680555607278 | 0.513 |
| 0.4032292288734908 | 0.092 |
| 0.7749077661729771 | 0.195 |
| 0.2560022539247109 | 0.411 |
| 0.21046003215521047 | 0.677 |
| 0.2951568608216424 | 0.413 |
| 0.0616712751846884 | 0.155 |
| 0.10642724760046984 | 0.234 |
| 0.14383613825062458 | 0.098 |
| 0.11142481941805915 | 0.655 |
| 0.21488145299598316 | 0.342 |
| 0.019922204238890573 | 0.601 |
| 0.40223077911210314 | 0.155 |
| 0.10058008812360408 | 0.854 |
| 0.3546296463503653 | 0.536 |
| 0.05200338246985281 | 0.736 |
| 0.862695661398457 | 0.07 |
| 0.438147291046718 | 0.54 |
| 0.15866895261064373 | 0.529 |
| 0.41119390668320044 | 0.107 |
| 0.03531212022274621 | 0.403 |
| 0.14327167497706705 | 0.257 |
| 0.3680421892630569 | 0.429 |
| 0.45297444098832185 | 0.415 |
| 0.035705226656315925 | 0.632 |
| 0.2955630113446468 | 0.537 |
| 0.24844275521099402 | 0.676 |
| 0.5553354138857104 | 0.122 |
| 0.3540847262638692 | 0.34 |
| 0.13010433660009424 | 0.018 |
| 0.8284457340816793 | 0.148 |
| 0.3737838460257775 | 0.589 |
| 0.5875870531923134 | 0.008 |
| 0.14498478365456702 | 0.13 |
| 0.09680045207139598 | 0.205 |
| 0.6575887476871082 | 0.155 |
| 0.10080010391823646 | 0.209 |
| 0.8413797501862097 | 0.125 |
| 0.2018201364306954 | 0.13 |
| 0.5601450185711807 | 0.405 |
| 0.1334964862004686 | 0.251 |
| 0.3089086759244848 | 0.433 |
| 0.3276261508227134 | 0.075 |
| 0.8189805101767723 | 0.027 |
| 0.11757481672631276 | 0.71 |
| 0.42621074419268834 | 0.051 |
| 0.5059518239168281 | 0.214 |
| 0.31490120363091434 | 0.172 |
| 0.1319161587733959 | 0.077 |
| 0.6754013431206971 | 0.293 |
| 0.21614592394583987 | 0.089 |
| 0.20160125269572549 | 0.657 |
| 0.05709138798307811 | 0.778 |
| 0.23008600623432485 | 0.477 |
| 0.3777284144624956 | 0.504 |
| 0.32891722024577474 | 0.199 |
| 0.0698441728842576 | 0.819 |
| 0.402649297921298 | 0.509 |
| 0.02562597937303368 | 0.092 |
| 0.13994559152963448 | 0.23 |
| 0.041500945474750583 | 0.085 |
| 0.2836531644226009 | 0.585 |
| 0.3220738842619494 | 0.102 |
| 0.15458083448625382 | 0.491 |
| 0.060009895120425316 | 0.747 |
| 0.39692888890238487 | 0.427 |
| 0.3914259996393801 | 0.403 |
| 0.36272015013494896 | 0.056 |
| 0.1289618461430856 | 0.089 |
| 0.5184736657169147 | 0.091 |
| 0.17849971626488448 | 0.341 |
| 0.4992974131576662 | 0.024 |
| 0.06536473324255598 | 0.602 |
| 0.14286905188746346 | 0.723 |
| 0.11726702670551048 | 0.61 |
| 0.33077264913471327 | 0.534 |
| 0.6928048492032047 | 0.257 |
| 0.8079285232394919 | 0.048 |
| 0.18971261080130797 | 0.753 |
| 0.0741281650340857 | 0.853 |
| 0.888177601124745 | 0.078 |
| 0.6194642285614361 | 0.363 |
| 0.8017279592314801 | 0.173 |
| 0.32668829045917924 | 0.037 |
| 0.2247129997701689 | 0.564 |
| 0.1098416082688437 | 0.502 |
| 0.8921881153382618 | 0.075 |
| 0.04526147531624303 | 0.71 |
| 0.08536741690032201 | 0.833 |
| 0.023968105536091744 | 0.483 |
| 0.12106714803235219 | 0.264 |
| 0.5893461321865815 | 0.09 |
| 0.1355528936284689 | 0.192 |
| 0.01724755996760119 | 0.912 |
| 0.5986837523413827 | 0.392 |
| 0.2635065290419063 | 0.427 |
| 0.24412349082354057 | 0.347 |
| 0.29453121827909423 | 0.456 |
| 0.6232256200859771 | 0.307 |
| 0.34824163917361595 | 0.549 |
| 0.3252964249687186 | 0.414 |
| 0.641021627209757 | 0.252 |
| 0.12121620385344434 | 0.261 |
| 0.15872982953186043 | 0.288 |
| 0.12299997078671232 | 0.637 |
| 0.3299898946197132 | 0.025 |
| 0.011450846376400703 | 0.501 |
| 0.12068057236599139 | 0.691 |
| 0.8579445161099126 | 0.025 |
| 0.5586384206843505 | 0.413 |
| 0.6295458055612355 | 0.085 |
| 0.13777802348978418 | 0.551 |
| 0.08977414990428834 | 0.527 |
| 0.12115798371849773 | 0.431 |
| 0.41448195688347733 | 0.327 |
| 0.40507730823473065 | 0.134 |
| 0.6506334028746801 | 0.27 |
| 0.6430883784454058 | 0.244 |
| 0.7407723321295534 | 0.205 |
| 0.3823068255769705 | 0.534 |
| 0.768640553051669 | 0.226 |
| 0.5797370026377184 | 0.33 |
| 0.21939863809323457 | 0.376 |
| 0.35920194021893925 | 0.288 |
| 0.17557150702302637 | 0.052 |
| 0.4702796191990455 | 0.128 |
| 0.30341677969525993 | 0.165 |
| 0.5354952737406244 | 0.274 |
| 0.17064476379458637 | 0.14 |
| 0.3289561388254081 | 0.14 |
| 0.45837649107329503 | 0.064 |
| 0.22550706696534883 | 0.708 |
| 0.6052466149168101 | 0.272 |
| 0.36308243080197966 | 0.574 |
| 0.41503889920170134 | 0.329 |
| 0.1542734896154171 | 0.414 |
| 0.40144351929977695 | 0.192 |
| 0.506023915387737 | 0.271 |
| 0.25398527454980313 | 0.216 |
| 0.31516787872583396 | 0.104 |
| 0.10989326075165007 | 0.609 |
| 0.08607500697444381 | 0.874 |
| 0.028141824299099505 | 0.691 |
| 0.18113938497222182 | 0.432 |
| 0.10732993748197373 | 0.084 |
| 0.39859403384761793 | 0.159 |
| 0.7093083731456793 | 0.078 |
| 0.3448875792596322 | 0.136 |
| 0.2640560473098643 | 0.1 |
| 0.40480289057910146 | 0.011 |
| 0.09491270635825944 | 0.213 |
| 0.0832955861881417 | 0.482 |
| 0.13922557517048018 | 0.301 |
| 0.36662843849541993 | 0.271 |
| 0.7032814060336646 | 0.167 |
| 0.2412321413399371 | 0.153 |
| 0.07402667030912002 | 0.865 |
| 0.1248387366728021 | 0.243 |
| 0.4363901345694595 | 0.487 |
| 0.22312519794661323 | 0.356 |
| 0.00046625445451231595 | 0.982 |
| 0.603156576235528 | 0.28 |
| 0.32171810133281475 | 0.183 |
| 0.4524033359814218 | 0.02 |
| 0.15995072063293037 | 0.287 |
| 0.007673783155829117 | 0.877 |
| 0.4639887095453299 | 0.068 |
| 0.7023893221480496 | 0.001 |
| 0.7966037773394677 | 0.201 |
| 0.2854721733487896 | 0.075 |
| 0.35175433433064296 | 0.287 |
| 0.1428417241494001 | 0.274 |
| 0.2687478542329488 | 0.35 |
| 0.2594998250970715 | 0.206 |
| 0.2777406015304602 | 0.263 |
| 0.14532300717027602 | 0.707 |
| 0.039684355438935004 | 0.409 |
| 0.6679331493319715 | 0.013 |